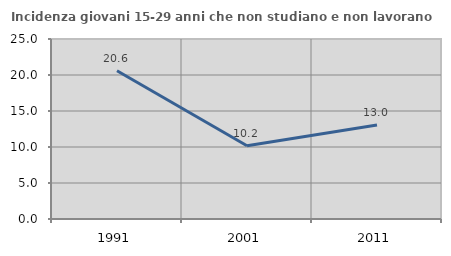
| Category | Incidenza giovani 15-29 anni che non studiano e non lavorano  |
|---|---|
| 1991.0 | 20.588 |
| 2001.0 | 10.18 |
| 2011.0 | 13.043 |